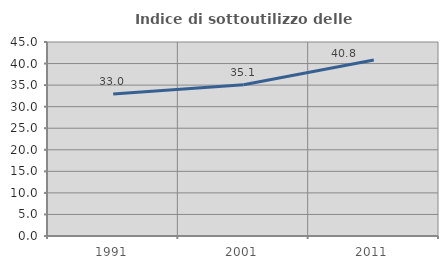
| Category | Indice di sottoutilizzo delle abitazioni  |
|---|---|
| 1991.0 | 32.964 |
| 2001.0 | 35.085 |
| 2011.0 | 40.823 |